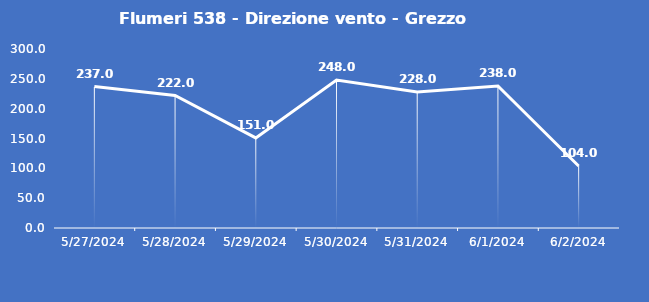
| Category | Flumeri 538 - Direzione vento - Grezzo (°N) |
|---|---|
| 5/27/24 | 237 |
| 5/28/24 | 222 |
| 5/29/24 | 151 |
| 5/30/24 | 248 |
| 5/31/24 | 228 |
| 6/1/24 | 238 |
| 6/2/24 | 104 |